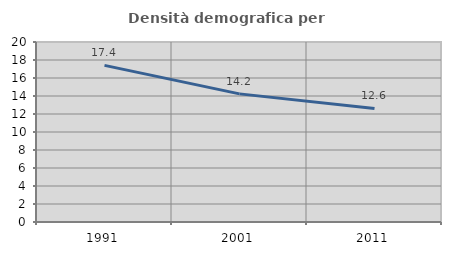
| Category | Densità demografica |
|---|---|
| 1991.0 | 17.405 |
| 2001.0 | 14.236 |
| 2011.0 | 12.624 |